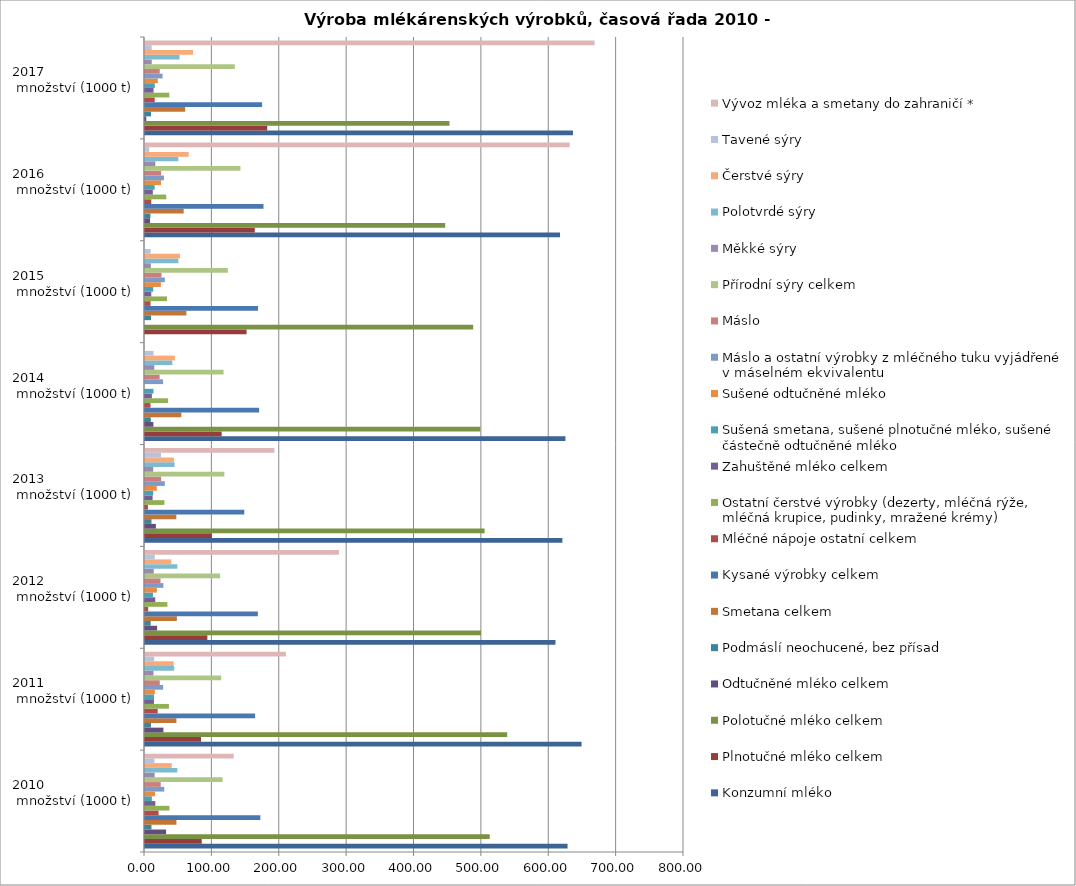
| Category | Konzumní mléko | Plnotučné mléko celkem | Polotučné mléko celkem | Odtučněné mléko celkem | Podmáslí neochucené, bez přísad | Smetana celkem | Kysané výrobky celkem | Mléčné nápoje ostatní celkem | Ostatní čerstvé výrobky (dezerty, mléčná rýže, mléčná krupice, pudinky, mražené krémy) | Zahuštěné mléko celkem | Sušená smetana, sušené plnotučné mléko, sušené částečně odtučněné mléko | Sušené odtučněné mléko | Máslo a ostatní výrobky z mléčného tuku vyjádřené v máselném ekvivalentu | Máslo | Přírodní sýry celkem | Měkké sýry | Polotvrdé sýry | Čerstvé sýry | Tavené sýry | Vývoz mléka a smetany do zahraničí * |
|---|---|---|---|---|---|---|---|---|---|---|---|---|---|---|---|---|---|---|---|---|
| 2010                       množství (1000 t) | 627.18 | 84.22 | 511.65 | 31.31 | 9.59 | 46.62 | 171.22 | 20.13 | 36.24 | 15.3 | 10.16 | 14.83 | 28.58 | 23.38 | 115.16 | 14.33 | 47.97 | 39.7 | 13.95 | 131.59 |
| 2011                       množství (1000 t) | 648.01 | 83.17 | 537.55 | 27.29 | 8.79 | 46.62 | 163.41 | 18.87 | 35.54 | 13.31 | 13.29 | 14.54 | 26.86 | 21.89 | 113.12 | 12.61 | 43.36 | 42.51 | 13.62 | 209.08 |
| 2012                       množství (1000 t) | 609.23 | 92.58 | 498.716 | 17.934 | 8.47 | 47.348 | 167.509 | 4.704 | 33.235 | 15.214 | 11.801 | 17.623 | 27.304 | 23.02 | 111.547 | 12.989 | 48.011 | 39.071 | 14.567 | 287.857 |
| 2013                       množství (1000 t) | 619.496 | 99.29 | 504.066 | 16.14 | 9.599 | 46.497 | 147.41 | 4.388 | 28.818 | 11.26 | 12.18 | 17.469 | 29.49 | 23.983 | 117.79 | 12.197 | 43.859 | 42.885 | 23.79 | 191.98 |
| 2014                       množství (1000 t) | 624.03 | 113.793 | 497.797 | 12.44 | 8.625 | 53.93 | 169.37 | 8.137 | 34.317 | 10.19 | 12.54 | 0 | 26.8 | 21.68 | 116.64 | 13.784 | 40.596 | 44.46 | 12.652 | 0 |
| 2015                       množství (1000 t) | 0 | 150.765 | 487.11 | 0 | 8.965 | 61.426 | 167.754 | 8.26 | 32.576 | 9.299 | 12.205 | 23.564 | 29.434 | 24.416 | 123.008 | 8.651 | 49.513 | 51.87 | 8.376 | 0 |
| 2016                       množství (1000 t) | 616.03 | 162.96 | 445.58 | 7.48 | 8.02 | 57.39 | 175.854 | 9.33 | 31.58 | 11.62 | 14.25 | 23.77 | 28.13 | 23.98 | 141.72 | 15.29 | 49.5 | 64.78 | 6.36 | 630.38 |
| 2017                       množství (1000 t) | 635.193 | 181.38 | 451.944 | 1.864 | 8.952 | 59.612 | 173.806 | 14.402 | 36.101 | 12.683 | 14.511 | 19.036 | 26.048 | 21.9 | 133.291 | 9.99 | 51.242 | 71.304 | 9.897 | 667.272 |